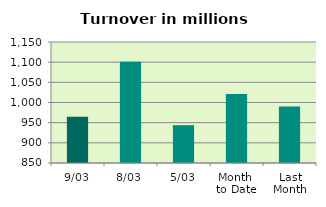
| Category | Series 0 |
|---|---|
| 9/03 | 964.675 |
| 8/03 | 1101.125 |
| 5/03 | 943.749 |
| Month 
to Date | 1021 |
| Last
Month | 989.924 |